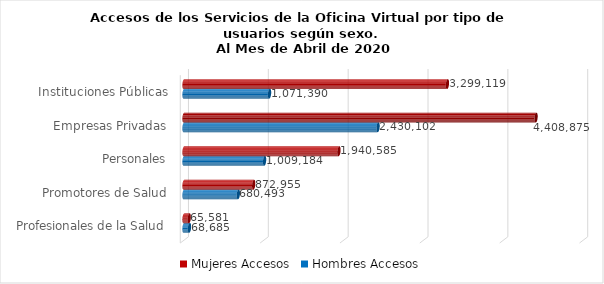
| Category | Mujeres | Hombres |
|---|---|---|
| Instituciones Públicas | 3299119 | 1071390 |
| Empresas Privadas | 4408875 | 2430102 |
| Personales | 1940585 | 1009184 |
| Promotores de Salud | 872955 | 680493 |
| Profesionales de la Salud | 65581 | 68685 |